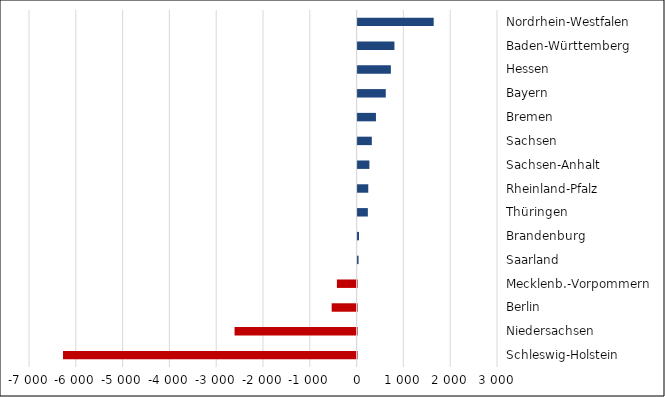
| Category | Series 0 |
|---|---|
| Schleswig-Holstein | -6273 |
| Niedersachsen | -2608 |
| Berlin | -533 |
| Mecklenb.-Vorpommern | -421 |
| Saarland | 21 |
| Brandenburg | 30 |
| Thüringen | 219 |
| Rheinland-Pfalz | 228 |
| Sachsen-Anhalt | 252 |
| Sachsen | 304 |
| Bremen | 392 |
| Bayern | 602 |
| Hessen | 711 |
| Baden-Württemberg | 787 |
| Nordrhein-Westfalen | 1626 |